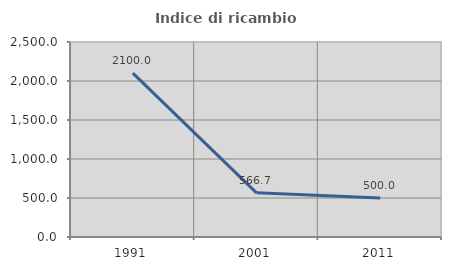
| Category | Indice di ricambio occupazionale  |
|---|---|
| 1991.0 | 2100 |
| 2001.0 | 566.667 |
| 2011.0 | 500 |